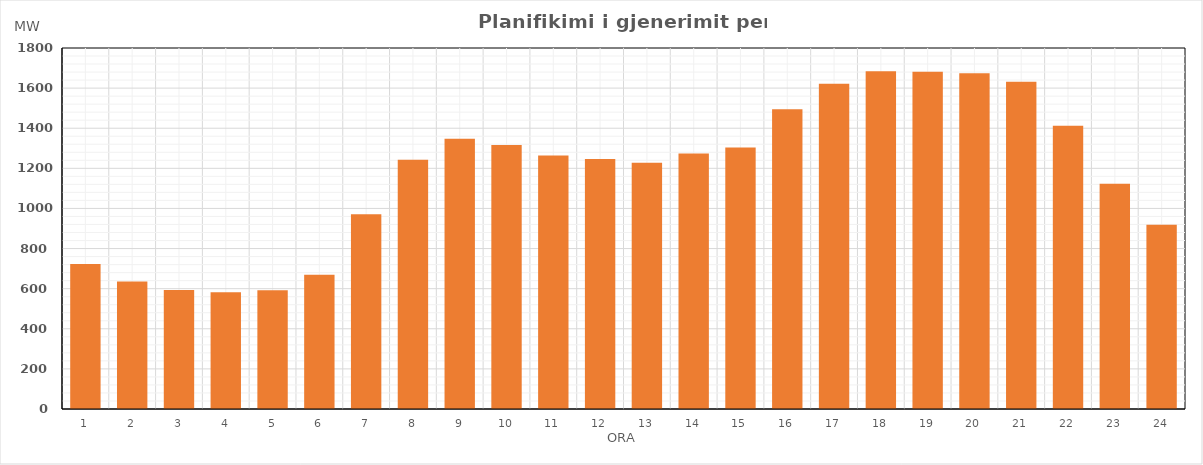
| Category | Max (MW) |
|---|---|
| 0 | 722.68 |
| 1 | 636.18 |
| 2 | 593.57 |
| 3 | 581.75 |
| 4 | 591.55 |
| 5 | 669.5 |
| 6 | 970.69 |
| 7 | 1243.1 |
| 8 | 1347.23 |
| 9 | 1316.93 |
| 10 | 1263.46 |
| 11 | 1246.91 |
| 12 | 1228.28 |
| 13 | 1273.45 |
| 14 | 1303.33 |
| 15 | 1494.11 |
| 16 | 1622.29 |
| 17 | 1684.42 |
| 18 | 1681.9 |
| 19 | 1673.69 |
| 20 | 1632.08 |
| 21 | 1412.09 |
| 22 | 1123.13 |
| 23 | 919.16 |